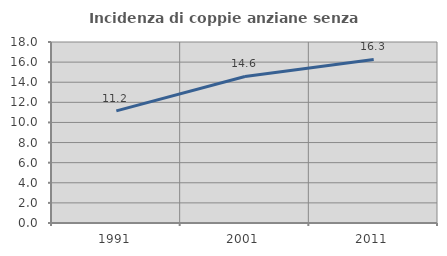
| Category | Incidenza di coppie anziane senza figli  |
|---|---|
| 1991.0 | 11.153 |
| 2001.0 | 14.575 |
| 2011.0 | 16.263 |